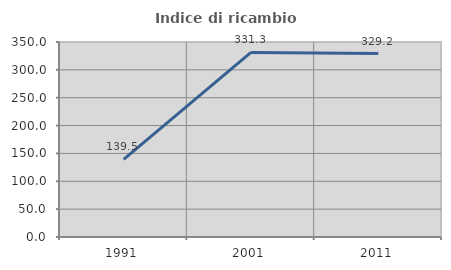
| Category | Indice di ricambio occupazionale  |
|---|---|
| 1991.0 | 139.474 |
| 2001.0 | 331.25 |
| 2011.0 | 329.167 |